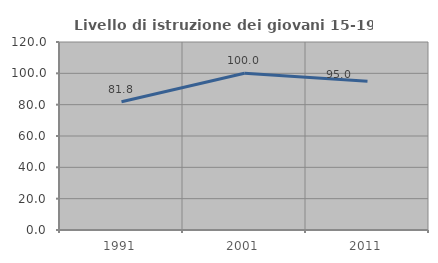
| Category | Livello di istruzione dei giovani 15-19 anni |
|---|---|
| 1991.0 | 81.818 |
| 2001.0 | 100 |
| 2011.0 | 95 |